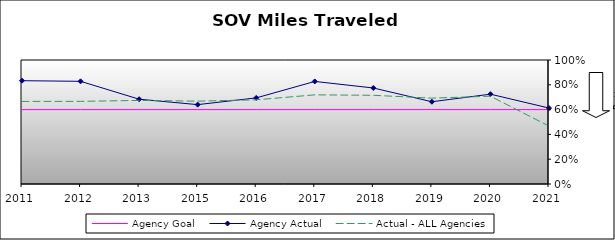
| Category | Agency Goal | Agency Actual | Actual - ALL Agencies |
|---|---|---|---|
| 2011.0 | 0.6 | 0.833 | 0.666 |
| 2012.0 | 0.6 | 0.828 | 0.666 |
| 2013.0 | 0.6 | 0.684 | 0.674 |
| 2015.0 | 0.6 | 0.64 | 0.668 |
| 2016.0 | 0.6 | 0.694 | 0.679 |
| 2017.0 | 0.6 | 0.827 | 0.719 |
| 2018.0 | 0.6 | 0.774 | 0.715 |
| 2019.0 | 0.6 | 0.663 | 0.692 |
| 2020.0 | 0.6 | 0.724 | 0.708 |
| 2021.0 | 0.6 | 0.613 | 0.467 |